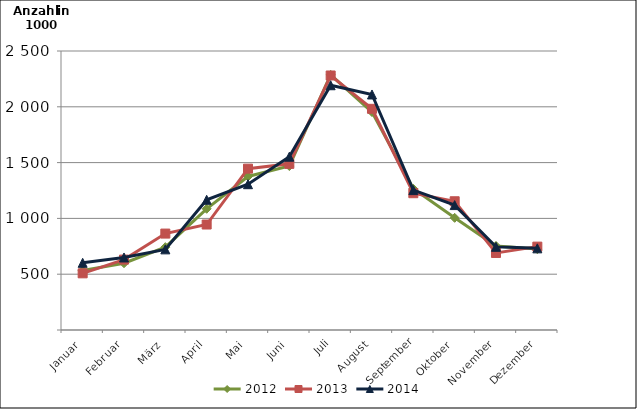
| Category | 2012 | 2013 | 2014 |
|---|---|---|---|
| Januar | 532.352 | 507.77 | 601.946 |
| Februar | 598.23 | 630.788 | 649.815 |
| März | 742.464 | 863.933 | 722.579 |
| April | 1086.098 | 945.166 | 1166.592 |
| Mai | 1375.434 | 1445.61 | 1306.515 |
| Juni | 1468.927 | 1488.805 | 1552.722 |
| Juli | 2286.277 | 2280.469 | 2193.232 |
| August | 1952.851 | 1981.894 | 2110.418 |
| September | 1265.036 | 1225.757 | 1253.526 |
| Oktober | 1005.098 | 1153.634 | 1119.269 |
| November | 753.447 | 690.221 | 745.384 |
| Dezember | 724.958 | 746.952 | 731.588 |